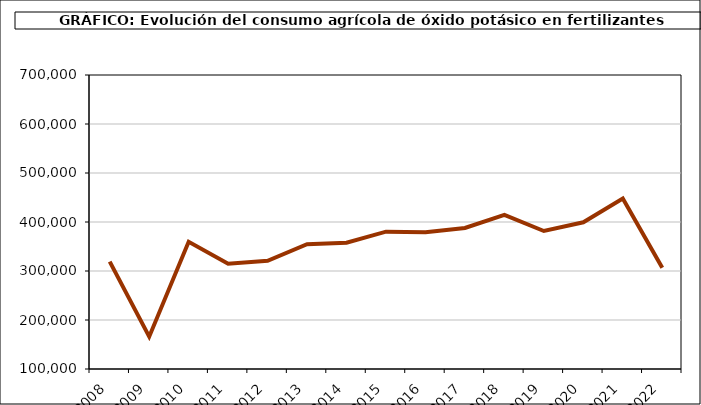
| Category | fertilizantes |
|---|---|
| 2008.0 | 319194 |
| 2009.0 | 166016 |
| 2010.0 | 359583 |
| 2011.0 | 314642 |
| 2012.0 | 320841 |
| 2013.0 | 354738 |
| 2014.0 | 357875 |
| 2015.0 | 380303 |
| 2016.0 | 379007 |
| 2017.0 | 387885 |
| 2018.0 | 414675 |
| 2019.0 | 381566 |
| 2020.0 | 399379 |
| 2021.0 | 447846 |
| 2022.0 | 306818.627 |